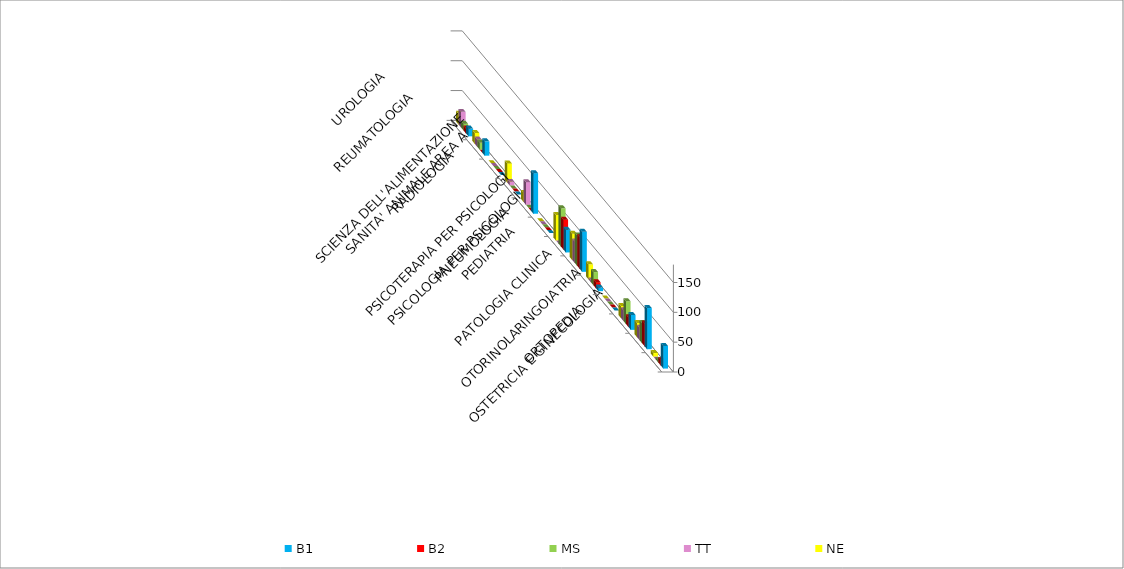
| Category | B1 | B2 | MS | TT | NE |
|---|---|---|---|---|---|
| ORTOPEDIA | 38 | 9 | 4 | 0 | 6 |
| OSTETRICIA E GINECOLOGIA | 69 | 38 | 34 | 21 | 24 |
| OTORINOLARINGOIATRIA | 25 | 16 | 38 | 18 | 20 |
| PATOLOGIA CLINICA | 0 | 0 | 0 | 0 | 0 |
| PEDIATRIA | 6 | 10 | 22 | 3 | 25 |
| PNEUMOLOGIA | 67 | 53 | 51 | 36 | 44 |
| PSICOLOGIA PER PSICOLOGI | 38 | 50 | 64 | 0 | 43 |
| PSICOTERAPIA PER PSICOLOGI | 0 | 0 | 0 | 0 | 0 |
| RADIOLOGIA | 68 | 0 | 0 | 38 | 15 |
| SANITA' ANIMALE AREA A | 0 | 0 | 0 | 6 | 32 |
| SCIENZA DELL'ALIMENTAZIONE | 0 | 0 | 0 | 0 | 0 |
| REUMATOLOGIA | 24 | 0 | 12 | 12 | 18 |
| UROLOGIA | 13 | 8 | 11 | 26 | 18 |